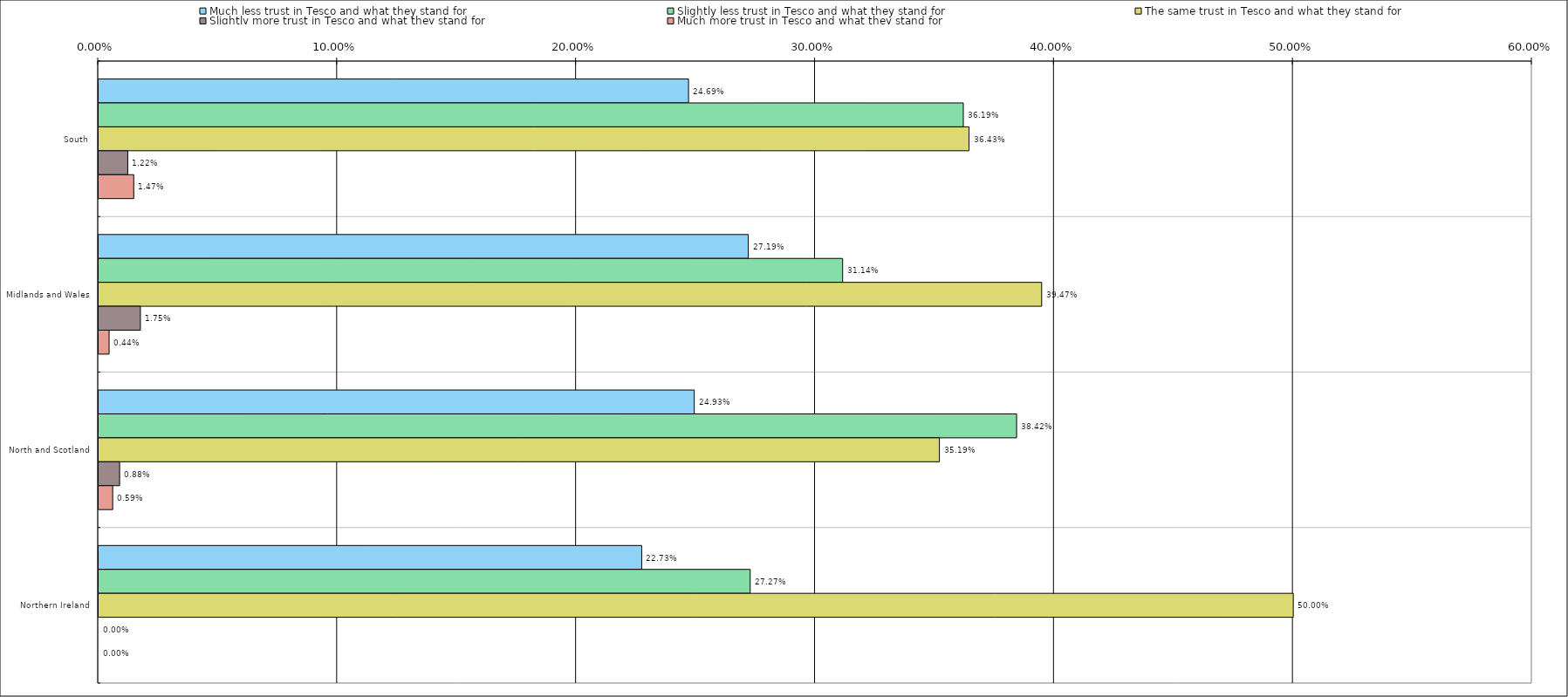
| Category | Much less trust in Tesco and what they stand for | Slightly less trust in Tesco and what they stand for | The same trust in Tesco and what they stand for | Slightly more trust in Tesco and what they stand for | Much more trust in Tesco and what they stand for |
|---|---|---|---|---|---|
| 0 | 0.247 | 0.362 | 0.364 | 0.012 | 0.015 |
| 1 | 0.272 | 0.311 | 0.395 | 0.018 | 0.004 |
| 2 | 0.249 | 0.384 | 0.352 | 0.009 | 0.006 |
| 3 | 0.227 | 0.273 | 0.5 | 0 | 0 |